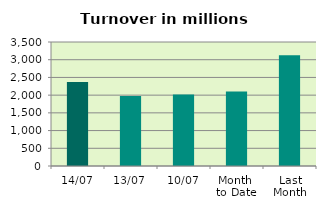
| Category | Series 0 |
|---|---|
| 14/07 | 2373.981 |
| 13/07 | 1976.084 |
| 10/07 | 2017.761 |
| Month 
to Date | 2101.204 |
| Last
Month | 3125.17 |